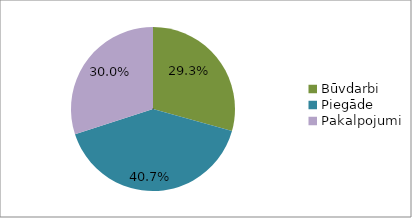
| Category | Series 0 |
|---|---|
| Būvdarbi | 0.293 |
| Piegāde | 0.407 |
| Pakalpojumi | 0.3 |